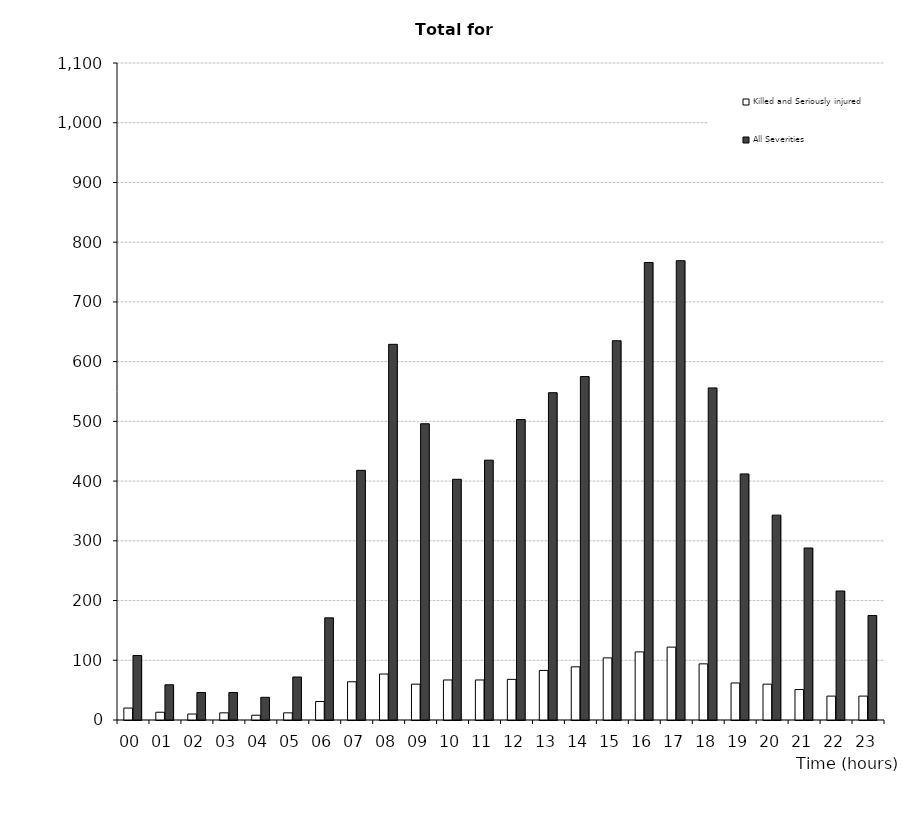
| Category | Killed and Seriously injured | All Severities |
|---|---|---|
| 00 | 20 | 108 |
| 01 | 13 | 59 |
| 02 | 10 | 46 |
| 03 | 12 | 46 |
| 04 | 8 | 38 |
| 05 | 12 | 72 |
| 06 | 31 | 171 |
| 07 | 64 | 418 |
| 08 | 77 | 629 |
| 09 | 60 | 496 |
| 10 | 67 | 403 |
| 11 | 67 | 435 |
| 12 | 68 | 503 |
| 13 | 83 | 548 |
| 14 | 89 | 575 |
| 15 | 104 | 635 |
| 16 | 114 | 766 |
| 17 | 122 | 769 |
| 18 | 94 | 556 |
| 19 | 62 | 412 |
| 20 | 60 | 343 |
| 21 | 51 | 288 |
| 22 | 40 | 216 |
| 23 | 40 | 175 |